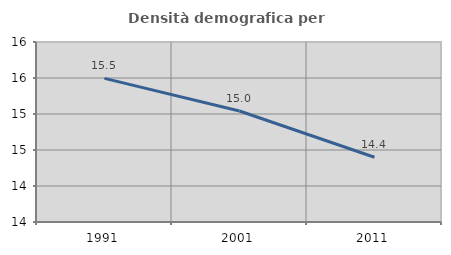
| Category | Densità demografica |
|---|---|
| 1991.0 | 15.494 |
| 2001.0 | 15.042 |
| 2011.0 | 14.4 |